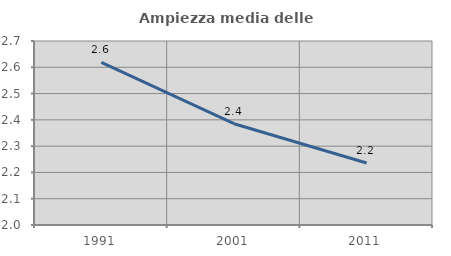
| Category | Ampiezza media delle famiglie |
|---|---|
| 1991.0 | 2.619 |
| 2001.0 | 2.385 |
| 2011.0 | 2.236 |